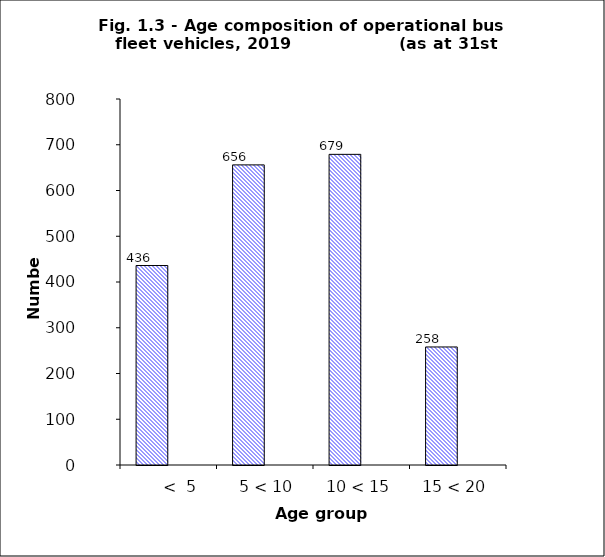
| Category | 2019 | 2020 |
|---|---|---|
|       <  5 | 436 | 0 |
|   5 < 10 | 656 | 0 |
| 10 < 15 | 679 | 0 |
| 15 < 20 | 258 | 0 |